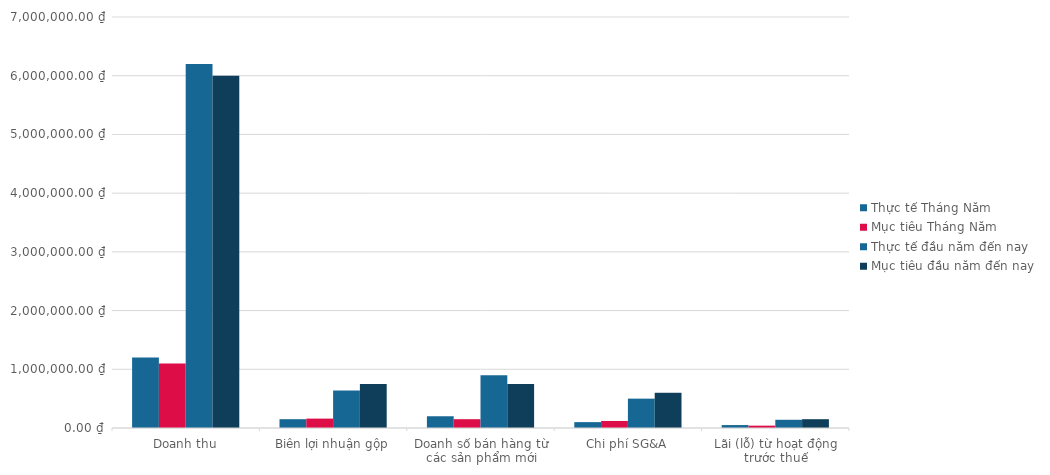
| Category | Thực tế Tháng Năm | Mục tiêu Tháng Năm | Thực tế đầu năm đến nay | Mục tiêu đầu năm đến nay |
|---|---|---|---|---|
| Doanh thu | 1200000 | 1100000 | 6200000 | 6000000 |
| Biên lợi nhuận gộp | 150000 | 160000 | 640000 | 750000 |
| Doanh số bán hàng từ các sản phẩm mới | 200000 | 150000 | 900000 | 750000 |
| Chi phí SG&A | 100000 | 120000 | 500000 | 600000 |
| Lãi (lỗ) từ hoạt động trước thuế | 50000 | 40000 | 140000 | 150000 |